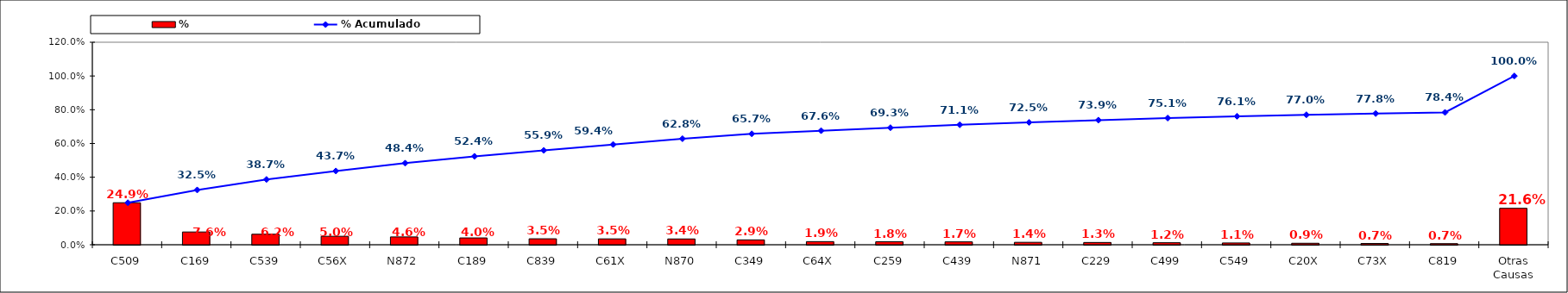
| Category | % |
|---|---|
| C509 | 0.249 |
| C169 | 0.076 |
| C539 | 0.062 |
| C56X | 0.05 |
| N872 | 0.046 |
| C189 | 0.04 |
| C839 | 0.035 |
| C61X | 0.035 |
| N870 | 0.034 |
| C349 | 0.029 |
| C64X | 0.019 |
| C259 | 0.018 |
| C439 | 0.017 |
| N871 | 0.014 |
| C229 | 0.013 |
| C499 | 0.012 |
| C549 | 0.011 |
| C20X | 0.009 |
| C73X | 0.007 |
| C819 | 0.007 |
| Otras Causas | 0.216 |